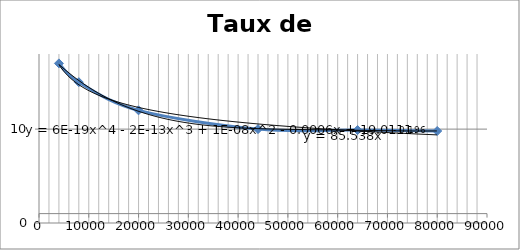
| Category | Taux de fuites |
|---|---|
| 4000.0 | 17 |
| 8000.0 | 15 |
| 20000.0 | 12 |
| 44000.0 | 10 |
| 64000.0 | 9.9 |
| 80000.0 | 9.8 |